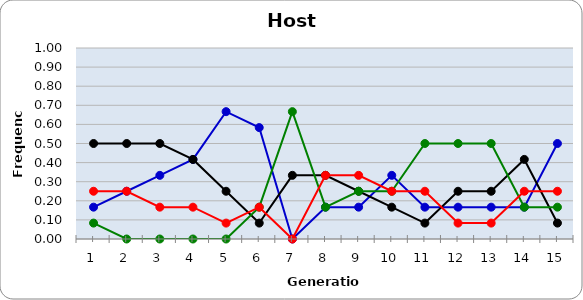
| Category | Sp | Cl | Di | He |
|---|---|---|---|---|
| 1.0 | 0.167 | 0.5 | 0.083 | 0.25 |
| 2.0 | 0.25 | 0.5 | 0 | 0.25 |
| 3.0 | 0.333 | 0.5 | 0 | 0.167 |
| 4.0 | 0.417 | 0.417 | 0 | 0.167 |
| 5.0 | 0.667 | 0.25 | 0 | 0.083 |
| 6.0 | 0.583 | 0.083 | 0.167 | 0.167 |
| 7.0 | 0 | 0.333 | 0.667 | 0 |
| 8.0 | 0.167 | 0.333 | 0.167 | 0.333 |
| 9.0 | 0.167 | 0.25 | 0.25 | 0.333 |
| 10.0 | 0.333 | 0.167 | 0.25 | 0.25 |
| 11.0 | 0.167 | 0.083 | 0.5 | 0.25 |
| 12.0 | 0.167 | 0.25 | 0.5 | 0.083 |
| 13.0 | 0.167 | 0.25 | 0.5 | 0.083 |
| 14.0 | 0.167 | 0.417 | 0.167 | 0.25 |
| 15.0 | 0.5 | 0.083 | 0.167 | 0.25 |